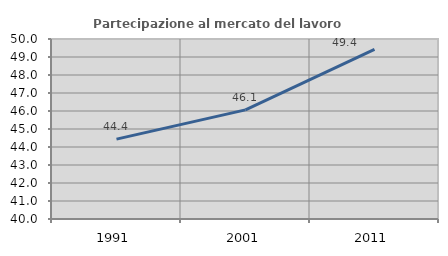
| Category | Partecipazione al mercato del lavoro  femminile |
|---|---|
| 1991.0 | 44.439 |
| 2001.0 | 46.063 |
| 2011.0 | 49.419 |